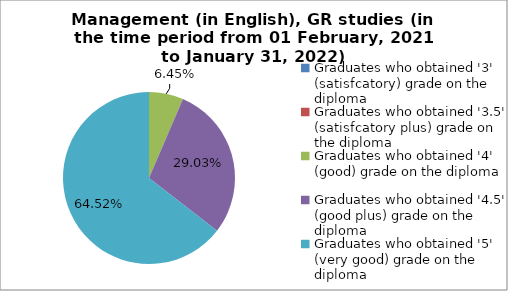
| Category | Series 0 |
|---|---|
| Graduates who obtained '3' (satisfcatory) grade on the diploma  | 0 |
| Graduates who obtained '3.5' (satisfcatory plus) grade on the diploma  | 0 |
| Graduates who obtained '4' (good) grade on the diploma  | 6.452 |
| Graduates who obtained '4.5' (good plus) grade on the diploma  | 29.032 |
| Graduates who obtained '5' (very good) grade on the diploma  | 64.516 |